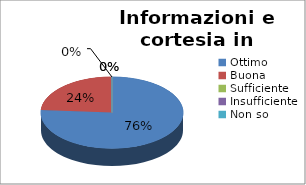
| Category | Informazioni e cortesia in accettazione |
|---|---|
| Ottimo | 16 |
| Buona | 5 |
| Sufficiente | 0 |
| Insufficiente | 0 |
| Non so | 0 |